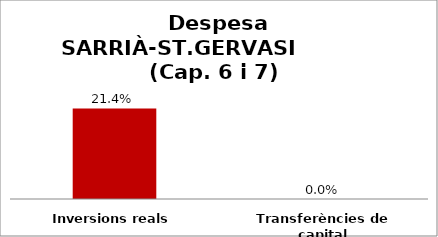
| Category | Series 0 |
|---|---|
| Inversions reals | 0.214 |
| Transferències de capital | 0 |